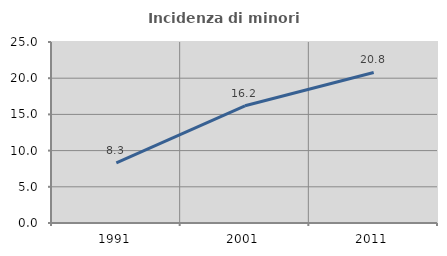
| Category | Incidenza di minori stranieri |
|---|---|
| 1991.0 | 8.297 |
| 2001.0 | 16.185 |
| 2011.0 | 20.797 |